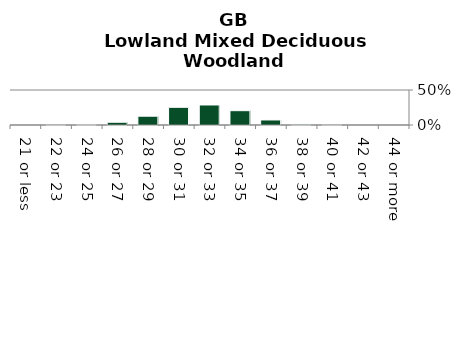
| Category | Lowland Mixed Deciduous Woodland |
|---|---|
| 21 or less | 0 |
| 22 or 23 | 0.001 |
| 24 or 25 | 0.008 |
| 26 or 27 | 0.039 |
| 28 or 29 | 0.126 |
| 30 or 31 | 0.253 |
| 32 or 33 | 0.286 |
| 34 or 35 | 0.205 |
| 36 or 37 | 0.072 |
| 38 or 39 | 0.01 |
| 40 or 41 | 0.001 |
| 42 or 43 | 0 |
| 44 or more | 0 |